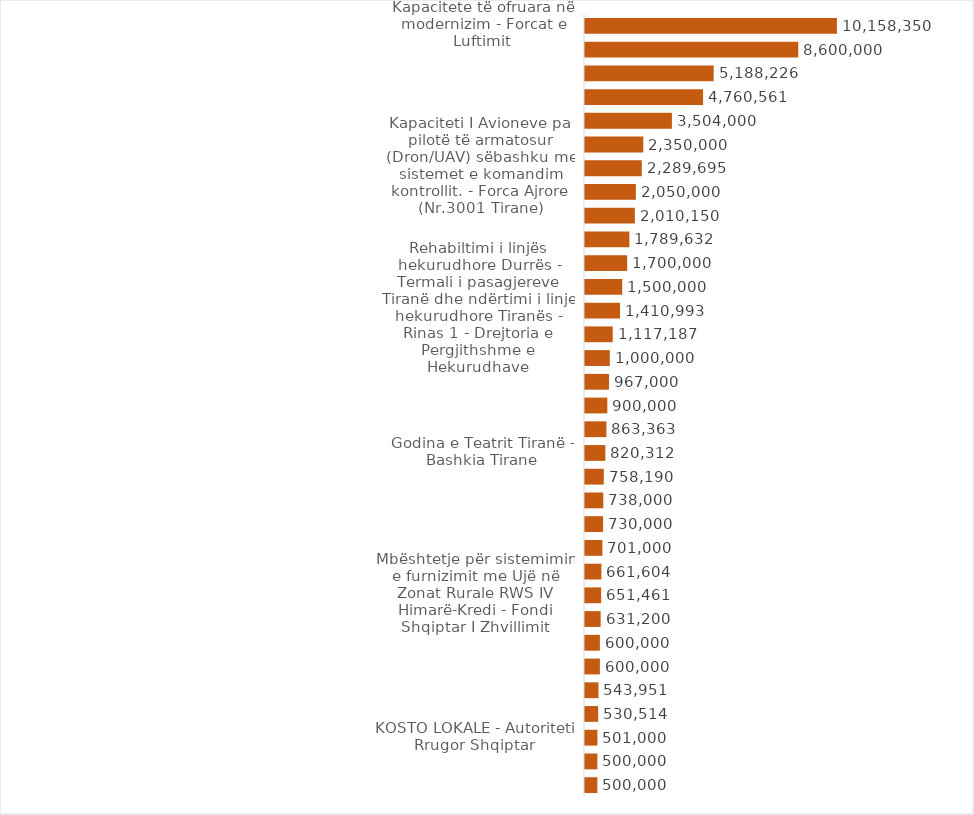
| Category | Parashikimi për v.2024  |
|---|---|
| Kapacitete të ofruara në modernizim - Forcat e Luftimit | 10158350 |
| Ndërtimi i Portit të Ri Porto Romano Durrës - Autoriteti Portual Durres | 8600000 |
| Ndërtim Tuneli i Llogarasë - Aparati I MIE | 5188226 |
| Armatimi i lehtë municion dhe makineri paisje - Forca Tokesore (RU 1001) | 4760561 |
| Kontrata e Koncesionit /PPP për përmiresimin, ndërtimin, operimin dhe mirëmbajtjen e rrugës së Arbrit - Aparati i MIE | 3504000 |
| Projekti për mbështetje në sektorin energjetik - Aparati i MIE (OSHE+OST) | 2350000 |
| Kapaciteti I Avioneve pa pilotë të armatosur (Dron/UAV) sëbashku me sistemet e komandim kontrollit. - Forca Ajrore (Nr.3001 Tirane) | 2289695 |
| Projekte të reja Investimi - Fondi Shqiptar I Zhvillimit | 2050000 |
| Projekte të programit me financim të huaj - Agjencia Kombëtare e Mbrojtjes Civile | 2010150 |
| Ndërtim segmenti rrugor Qukës - Qafë Plloçë - Njesia e menaxhimit te Projektit Qukes -Qafe Plloc financuar nga BIZH | 1789632 |
| Fatkeqësi natyrore të menaxhuara - Agjencia Kombëtare e Mbrojtjes Civile | 1700000 |
| Projekte me BE - AZHBR | 1500000 |
| Rehabiltimi i linjës hekurudhore Durrës - Termali i pasagjereve Tiranë dhe ndërtimi i linje hekurudhore Tiranës - Rinas 1 - Drejtoria e Pergjithshme e Hekurudhave | 1410993 |
| Rehabiltimi i linjës hekurudhore Durrës - Termali i pasagjereve Tiranë dhe ndërtimi i linje hekurudhore Tiranës - Rinas 2 - Drejtoria e Pergjithshme e Hekurudhave | 1117187 |
| Investime të reja - Fondi Shqiptar I Zhvillimit | 1000000 |
| Kontrata e Koncesionit /PPP për projektimin, ndërtimin dhe mirëmbajtjen e rrugës Porti I Jahteve - By Pass Orikum -Dukat (Ura e Shën Elizës) - Aparati I MIE | 967000 |
| Projekti I Zhvillimit të Integruar Urban dhe Turistik - Fondi Shqiptar I Zhvillimit | 900000 |
| Programi i rrugëve Rurale - Fondi Shqiptar I Zhvillimit | 863363.062 |
| Godina e Teatrit Tiranë - Bashkia Tirane | 820312 |
| Fondi për Zhvillimin e infrastrukturës shkollore 2024-2026 - Aparati i Ministrisë | 758189.738 |
| Subvencioni I kontratës koncesionare për ndërtimin, përmiresimin, shfrytëzimin, mirëmbajtjen dhe rehabilitimin e autostradës Milot - Morinë - Aparati i MIE | 738000 |
| TVSH - AKUM | 730000 |
| TVSH e TAKSË DOGANORE - Autoriteti Rrugor Shqiptar | 701000 |
| Ndërtim rruga Berat - Ballaban, Loti 3 - Autoriteti Rrugor Shqiptar | 661604 |
| Mbështetje për sistemimin e furnizimit me Ujë në Zonat Rurale RWS IV Himarë-Kredi - Fondi Shqiptar I Zhvillimit | 651461.173 |
| Ngritja dhe Ndërtimi i Institucionit për edukim dhe rehabilitim të të miturve (hartim projektim, rikonstruksion supervizion dhe kolaudim) - Aparati i Ministrise | 631200 |
| Zgjerimi i rrugës Elbasan - Qafë - Thanë (Faza V) - Autoriteti Rrugor Shqiptar | 600000 |
| Qendra e monitorimit të trafikut Faza e II - Autoriteti Rrugor Shqiptar | 600000 |
| Upgrade i sistemit të komunikimit të Policisë së Shtetit- DATACOM - Agjencia Kombetare e Shoqerise se Informacionit | 543951 |
| Programi i Rindërtimit /Kredi/Grant - Fondi Shqiptar I Zhvillimit | 530513.765 |
| KOSTO LOKALE - Autoriteti Rrugor Shqiptar | 501000 |
| Projekte të kërkimit shkencor - Aparati i Ministrise se Arsimit, Sportit dhe Rinise | 500000 |
| Programi i Rehabilitimit të Lumit të Vlorës (Saudit)/Kredi - Fondi Shqiptar I Zhvillimit | 500000 |